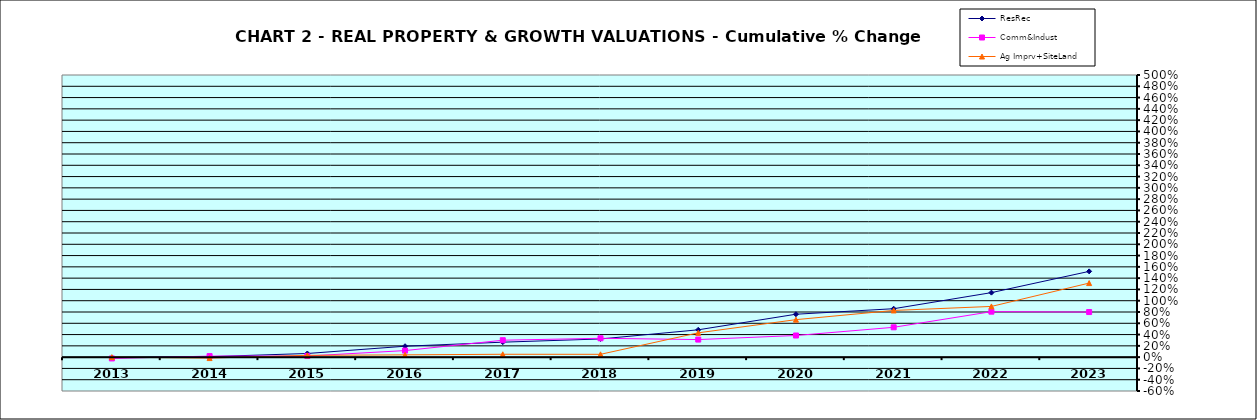
| Category | ResRec | Comm&Indust | Ag Imprv+SiteLand |
|---|---|---|---|
| 2013.0 | -0.006 | -0.023 | 0 |
| 2014.0 | 0.009 | 0.018 | -0.016 |
| 2015.0 | 0.065 | 0.02 | 0.032 |
| 2016.0 | 0.194 | 0.116 | 0.041 |
| 2017.0 | 0.265 | 0.3 | 0.051 |
| 2018.0 | 0.322 | 0.334 | 0.05 |
| 2019.0 | 0.484 | 0.311 | 0.431 |
| 2020.0 | 0.761 | 0.383 | 0.664 |
| 2021.0 | 0.858 | 0.529 | 0.827 |
| 2022.0 | 1.143 | 0.806 | 0.899 |
| 2023.0 | 1.52 | 0.799 | 1.312 |